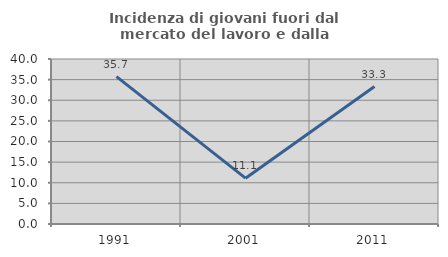
| Category | Incidenza di giovani fuori dal mercato del lavoro e dalla formazione  |
|---|---|
| 1991.0 | 35.714 |
| 2001.0 | 11.111 |
| 2011.0 | 33.333 |